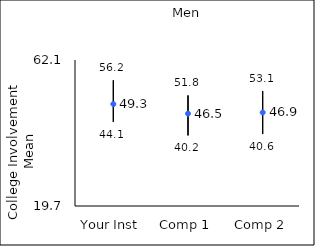
| Category | 25th percentile | 75th percentile | Mean |
|---|---|---|---|
| Your Inst | 44.1 | 56.2 | 49.3 |
| Comp 1 | 40.2 | 51.8 | 46.53 |
| Comp 2 | 40.6 | 53.1 | 46.86 |